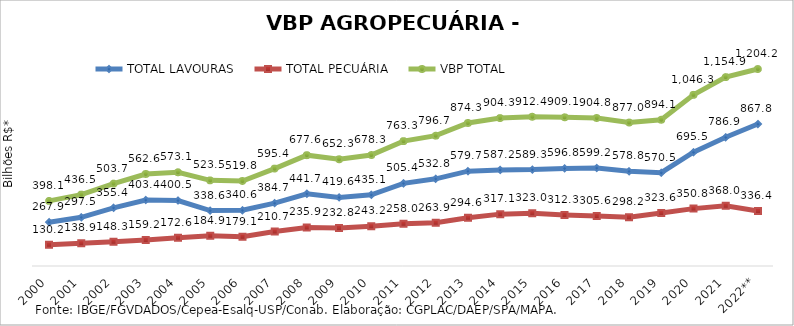
| Category | TOTAL LAVOURAS | TOTAL PECUÁRIA | VBP TOTAL |
|---|---|---|---|
| 2000 | 267.859 | 130.204 | 398.063 |
| 2001 | 297.542 | 138.911 | 436.453 |
| 2002 | 355.424 | 148.288 | 503.712 |
| 2003 | 403.404 | 159.161 | 562.565 |
| 2004 | 400.45 | 172.645 | 573.095 |
| 2005 | 338.563 | 184.945 | 523.507 |
| 2006 | 340.631 | 179.121 | 519.752 |
| 2007 | 384.68 | 210.726 | 595.406 |
| 2008 | 441.708 | 235.852 | 677.56 |
| 2009 | 419.564 | 232.785 | 652.349 |
| 2010 | 435.134 | 243.215 | 678.349 |
| 2011 | 505.355 | 257.989 | 763.344 |
| 2012 | 532.836 | 263.907 | 796.743 |
| 2013 | 579.729 | 294.62 | 874.349 |
| 2014 | 587.187 | 317.095 | 904.283 |
| 2015 | 589.318 | 323.034 | 912.351 |
| 2016 | 596.77 | 312.293 | 909.062 |
| 2017 | 599.248 | 305.582 | 904.83 |
| 2018 | 578.839 | 298.192 | 877.031 |
| 2019 | 570.515 | 323.624 | 894.139 |
| 2020 | 695.472 | 350.788 | 1046.259 |
| 2021 | 786.943 | 367.967 | 1154.91 |
| 2022** | 867.8 | 336.41 | 1204.21 |